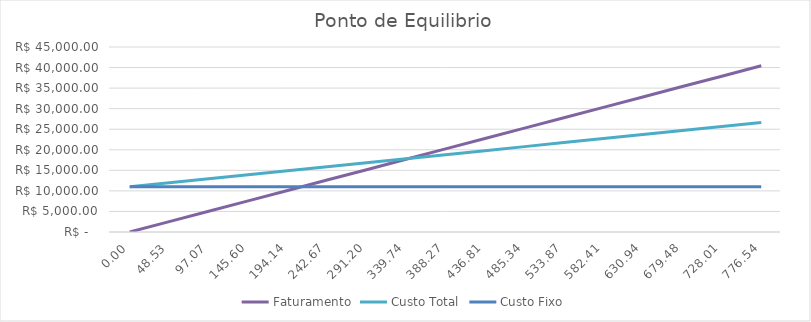
| Category | Faturamento | Custo Total | Custo Fixo |
|---|---|---|---|
| 0.0 | 0 | 11000 | 11000 |
| 48.53401205778637 | 2526.709 | 11976.53 | 11000 |
| 97.06802411557274 | 5053.418 | 12953.06 | 11000 |
| 145.6020361733591 | 7580.127 | 13929.59 | 11000 |
| 194.13604823114548 | 10106.837 | 14906.12 | 11000 |
| 242.67006028893186 | 12633.546 | 15882.65 | 11000 |
| 291.2040723467182 | 15160.255 | 16859.18 | 11000 |
| 339.73808440450455 | 17686.964 | 17835.71 | 11000 |
| 388.2720964622909 | 20213.673 | 18812.24 | 11000 |
| 436.80610852007726 | 22740.382 | 19788.77 | 11000 |
| 485.3401205778636 | 25267.091 | 20765.3 | 11000 |
| 533.8741326356501 | 27793.8 | 21741.83 | 11000 |
| 582.4081446934364 | 30320.51 | 22718.36 | 11000 |
| 630.9421567512228 | 32847.219 | 23694.89 | 11000 |
| 679.4761688090091 | 35373.928 | 24671.42 | 11000 |
| 728.0101808667956 | 37900.637 | 25647.95 | 11000 |
| 776.5441929245819 | 40427.346 | 26624.48 | 11000 |